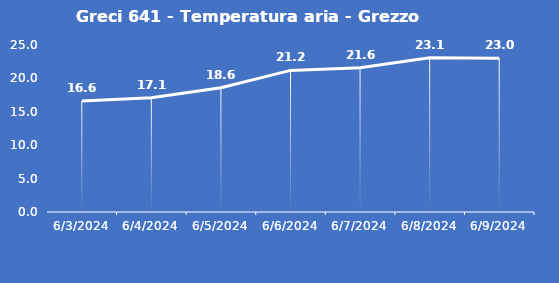
| Category | Greci 641 - Temperatura aria - Grezzo (°C) |
|---|---|
| 6/3/24 | 16.6 |
| 6/4/24 | 17.1 |
| 6/5/24 | 18.6 |
| 6/6/24 | 21.2 |
| 6/7/24 | 21.6 |
| 6/8/24 | 23.1 |
| 6/9/24 | 23 |